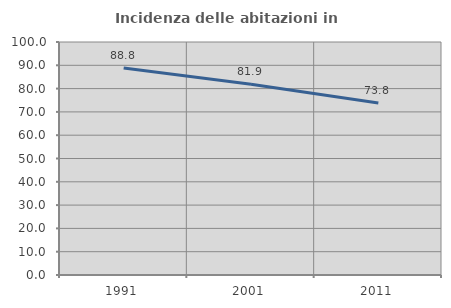
| Category | Incidenza delle abitazioni in proprietà  |
|---|---|
| 1991.0 | 88.831 |
| 2001.0 | 81.865 |
| 2011.0 | 73.803 |